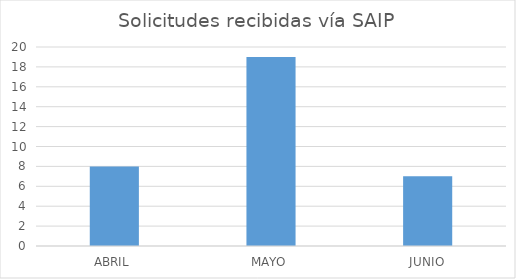
| Category | Series 0 |
|---|---|
| ABRIL | 8 |
| MAYO | 19 |
| JUNIO | 7 |